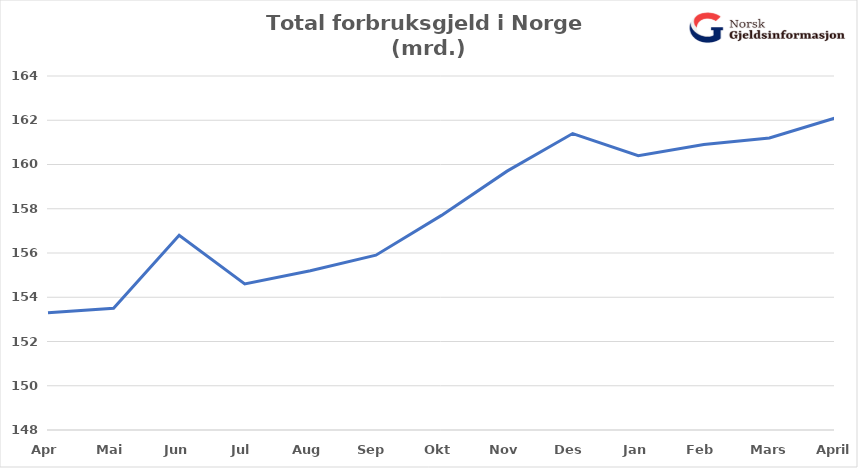
| Category | Total usikret gjeld (mrd) |
|---|---|
| Apr | 153.3 |
| Mai | 153.5 |
| Jun | 156.8 |
| Jul | 154.6 |
| Aug | 155.2 |
| Sep | 155.9 |
| Okt | 157.7 |
| Nov | 159.7 |
| Des | 161.4 |
| Jan | 160.4 |
| Feb | 160.9 |
| Mars | 161.2 |
| April | 162.1 |